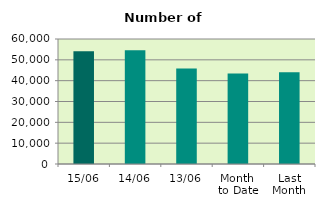
| Category | Series 0 |
|---|---|
| 15/06 | 54160 |
| 14/06 | 54558 |
| 13/06 | 45852 |
| Month 
to Date | 43468.364 |
| Last
Month | 44009.364 |